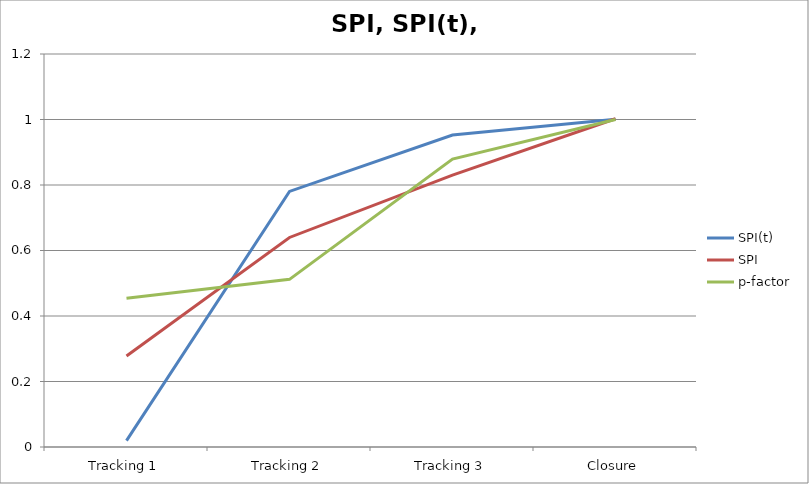
| Category | SPI(t) | SPI | p-factor |
|---|---|---|---|
| Tracking 1 | 0.019 | 0.278 | 0.455 |
| Tracking 2 | 0.78 | 0.64 | 0.512 |
| Tracking 3 | 0.953 | 0.83 | 0.879 |
| Closure | 1.001 | 1.002 | 1 |